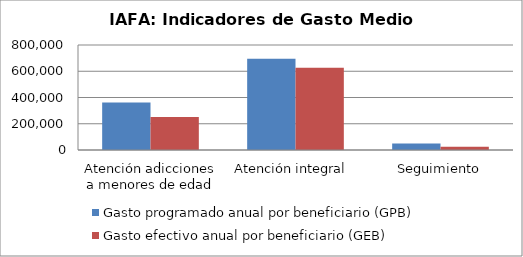
| Category | Gasto programado anual por beneficiario (GPB)  | Gasto efectivo anual por beneficiario (GEB)  |
|---|---|---|
| Atención adicciones a menores de edad | 362464.646 | 250533.616 |
| Atención integral  | 695500 | 627164.206 |
| Seguimiento | 49019.608 | 25601.458 |